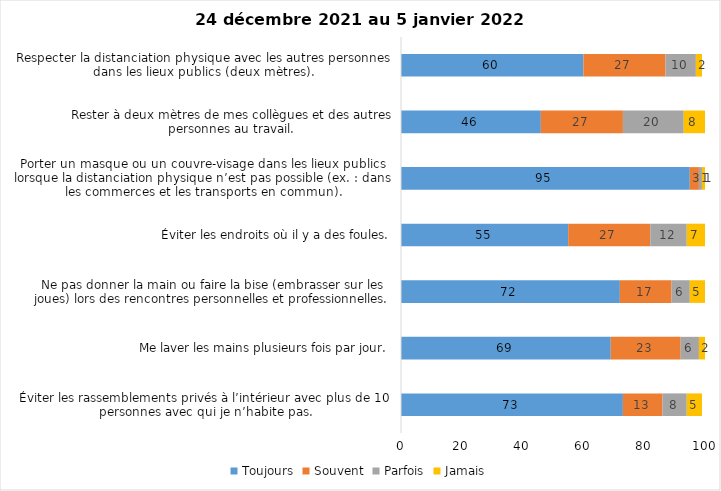
| Category | Toujours | Souvent | Parfois | Jamais |
|---|---|---|---|---|
| Éviter les rassemblements privés à l’intérieur avec plus de 10 personnes avec qui je n’habite pas. | 73 | 13 | 8 | 5 |
| Me laver les mains plusieurs fois par jour. | 69 | 23 | 6 | 2 |
| Ne pas donner la main ou faire la bise (embrasser sur les joues) lors des rencontres personnelles et professionnelles. | 72 | 17 | 6 | 5 |
| Éviter les endroits où il y a des foules. | 55 | 27 | 12 | 7 |
| Porter un masque ou un couvre-visage dans les lieux publics lorsque la distanciation physique n’est pas possible (ex. : dans les commerces et les transports en commun). | 95 | 3 | 1 | 1 |
| Rester à deux mètres de mes collègues et des autres personnes au travail. | 46 | 27 | 20 | 8 |
| Respecter la distanciation physique avec les autres personnes dans les lieux publics (deux mètres). | 60 | 27 | 10 | 2 |